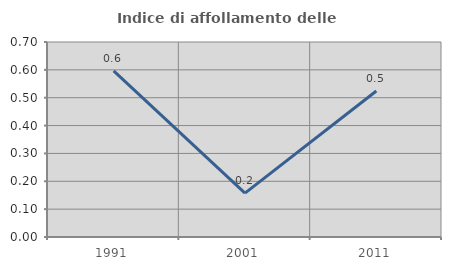
| Category | Indice di affollamento delle abitazioni  |
|---|---|
| 1991.0 | 0.597 |
| 2001.0 | 0.158 |
| 2011.0 | 0.524 |